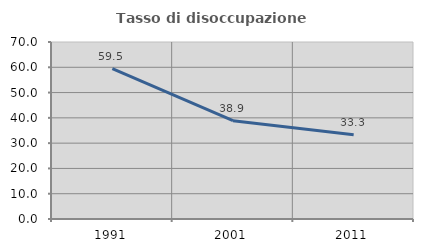
| Category | Tasso di disoccupazione giovanile  |
|---|---|
| 1991.0 | 59.459 |
| 2001.0 | 38.889 |
| 2011.0 | 33.333 |